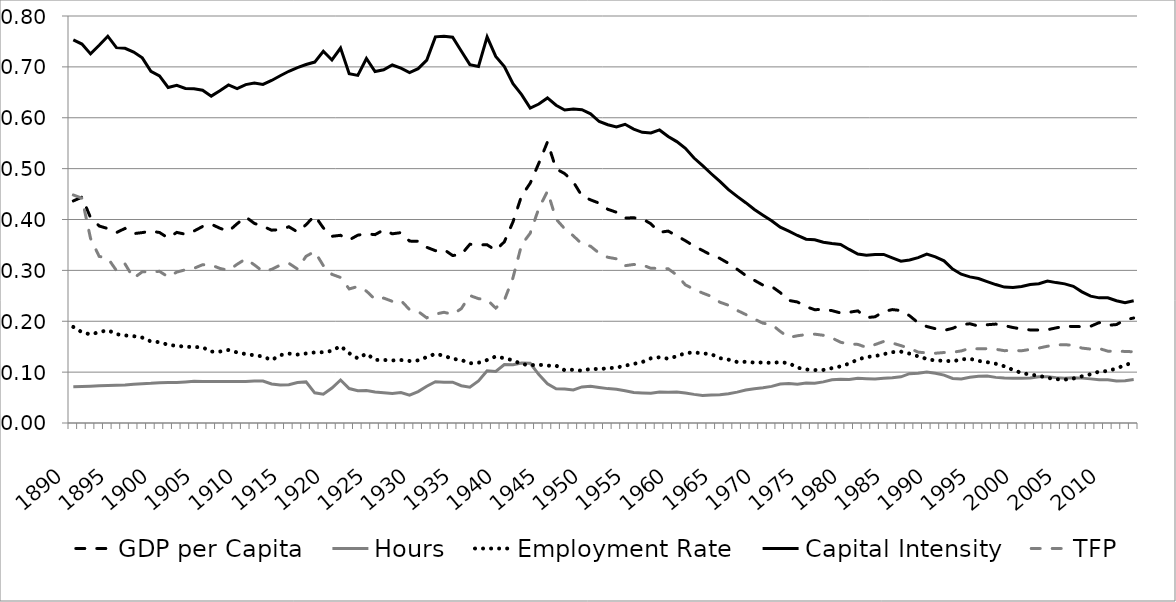
| Category | GDP per Capita | Hours | Employment Rate | Capital Intensity | TFP |
|---|---|---|---|---|---|
| 1890.0 | 0.437 | 0.071 | 0.189 | 0.753 | 0.448 |
| 1891.0 | 0.444 | 0.072 | 0.178 | 0.745 | 0.442 |
| 1892.0 | 0.404 | 0.072 | 0.174 | 0.726 | 0.363 |
| 1893.0 | 0.387 | 0.073 | 0.179 | 0.742 | 0.328 |
| 1894.0 | 0.382 | 0.074 | 0.183 | 0.76 | 0.324 |
| 1895.0 | 0.374 | 0.074 | 0.175 | 0.738 | 0.3 |
| 1896.0 | 0.382 | 0.075 | 0.172 | 0.737 | 0.313 |
| 1897.0 | 0.372 | 0.076 | 0.171 | 0.729 | 0.285 |
| 1898.0 | 0.374 | 0.077 | 0.168 | 0.718 | 0.297 |
| 1899.0 | 0.377 | 0.078 | 0.16 | 0.691 | 0.297 |
| 1900.0 | 0.374 | 0.079 | 0.159 | 0.682 | 0.298 |
| 1901.0 | 0.364 | 0.079 | 0.154 | 0.659 | 0.287 |
| 1902.0 | 0.375 | 0.08 | 0.152 | 0.664 | 0.297 |
| 1903.0 | 0.371 | 0.081 | 0.15 | 0.658 | 0.301 |
| 1904.0 | 0.377 | 0.082 | 0.149 | 0.657 | 0.304 |
| 1905.0 | 0.386 | 0.082 | 0.149 | 0.654 | 0.311 |
| 1906.0 | 0.391 | 0.081 | 0.14 | 0.643 | 0.311 |
| 1907.0 | 0.383 | 0.081 | 0.14 | 0.653 | 0.304 |
| 1908.0 | 0.377 | 0.081 | 0.144 | 0.664 | 0.3 |
| 1909.0 | 0.392 | 0.081 | 0.139 | 0.657 | 0.312 |
| 1910.0 | 0.405 | 0.082 | 0.135 | 0.665 | 0.323 |
| 1911.0 | 0.392 | 0.082 | 0.133 | 0.668 | 0.311 |
| 1912.0 | 0.387 | 0.083 | 0.131 | 0.665 | 0.298 |
| 1913.0 | 0.379 | 0.077 | 0.124 | 0.673 | 0.302 |
| 1914.0 | 0.38 | 0.075 | 0.133 | 0.683 | 0.31 |
| 1915.0 | 0.386 | 0.075 | 0.136 | 0.691 | 0.314 |
| 1916.0 | 0.376 | 0.08 | 0.135 | 0.699 | 0.303 |
| 1917.0 | 0.39 | 0.081 | 0.137 | 0.705 | 0.328 |
| 1918.0 | 0.408 | 0.059 | 0.139 | 0.709 | 0.337 |
| 1919.0 | 0.383 | 0.057 | 0.139 | 0.731 | 0.309 |
| 1920.0 | 0.367 | 0.069 | 0.142 | 0.714 | 0.292 |
| 1921.0 | 0.369 | 0.084 | 0.151 | 0.737 | 0.286 |
| 1922.0 | 0.36 | 0.068 | 0.137 | 0.687 | 0.263 |
| 1923.0 | 0.369 | 0.063 | 0.127 | 0.683 | 0.268 |
| 1924.0 | 0.372 | 0.064 | 0.136 | 0.716 | 0.259 |
| 1925.0 | 0.37 | 0.061 | 0.124 | 0.691 | 0.243 |
| 1926.0 | 0.38 | 0.059 | 0.124 | 0.694 | 0.246 |
| 1927.0 | 0.372 | 0.058 | 0.123 | 0.704 | 0.239 |
| 1928.0 | 0.374 | 0.06 | 0.124 | 0.697 | 0.241 |
| 1929.0 | 0.358 | 0.055 | 0.122 | 0.689 | 0.223 |
| 1930.0 | 0.357 | 0.062 | 0.123 | 0.697 | 0.219 |
| 1931.0 | 0.345 | 0.072 | 0.13 | 0.713 | 0.207 |
| 1932.0 | 0.339 | 0.081 | 0.136 | 0.759 | 0.214 |
| 1933.0 | 0.341 | 0.08 | 0.132 | 0.76 | 0.218 |
| 1934.0 | 0.329 | 0.08 | 0.126 | 0.758 | 0.214 |
| 1935.0 | 0.331 | 0.073 | 0.124 | 0.731 | 0.225 |
| 1936.0 | 0.351 | 0.07 | 0.117 | 0.704 | 0.25 |
| 1937.0 | 0.35 | 0.083 | 0.118 | 0.701 | 0.244 |
| 1938.0 | 0.35 | 0.103 | 0.124 | 0.759 | 0.242 |
| 1939.0 | 0.339 | 0.101 | 0.131 | 0.721 | 0.226 |
| 1940.0 | 0.356 | 0.115 | 0.127 | 0.701 | 0.241 |
| 1941.0 | 0.395 | 0.115 | 0.123 | 0.667 | 0.286 |
| 1942.0 | 0.447 | 0.118 | 0.116 | 0.645 | 0.351 |
| 1943.0 | 0.471 | 0.117 | 0.114 | 0.619 | 0.373 |
| 1944.0 | 0.511 | 0.095 | 0.115 | 0.627 | 0.422 |
| 1945.0 | 0.552 | 0.077 | 0.113 | 0.639 | 0.456 |
| 1946.0 | 0.5 | 0.067 | 0.113 | 0.625 | 0.401 |
| 1947.0 | 0.49 | 0.067 | 0.104 | 0.615 | 0.382 |
| 1948.0 | 0.474 | 0.065 | 0.105 | 0.617 | 0.368 |
| 1949.0 | 0.446 | 0.071 | 0.103 | 0.616 | 0.352 |
| 1950.0 | 0.439 | 0.072 | 0.106 | 0.608 | 0.347 |
| 1951.0 | 0.432 | 0.07 | 0.106 | 0.593 | 0.334 |
| 1952.0 | 0.42 | 0.068 | 0.108 | 0.586 | 0.326 |
| 1953.0 | 0.414 | 0.066 | 0.109 | 0.582 | 0.323 |
| 1954.0 | 0.403 | 0.063 | 0.113 | 0.587 | 0.309 |
| 1955.0 | 0.403 | 0.06 | 0.116 | 0.578 | 0.312 |
| 1956.0 | 0.402 | 0.059 | 0.12 | 0.571 | 0.311 |
| 1957.0 | 0.391 | 0.059 | 0.127 | 0.57 | 0.304 |
| 1958.0 | 0.375 | 0.061 | 0.129 | 0.576 | 0.304 |
| 1959.0 | 0.377 | 0.061 | 0.126 | 0.563 | 0.303 |
| 1960.0 | 0.368 | 0.061 | 0.131 | 0.553 | 0.291 |
| 1961.0 | 0.358 | 0.059 | 0.137 | 0.54 | 0.271 |
| 1962.0 | 0.348 | 0.056 | 0.139 | 0.521 | 0.263 |
| 1963.0 | 0.339 | 0.054 | 0.137 | 0.506 | 0.255 |
| 1964.0 | 0.33 | 0.055 | 0.135 | 0.49 | 0.249 |
| 1965.0 | 0.324 | 0.055 | 0.127 | 0.475 | 0.237 |
| 1966.0 | 0.314 | 0.058 | 0.125 | 0.459 | 0.231 |
| 1967.0 | 0.302 | 0.061 | 0.12 | 0.445 | 0.221 |
| 1968.0 | 0.29 | 0.065 | 0.12 | 0.433 | 0.213 |
| 1969.0 | 0.28 | 0.067 | 0.119 | 0.42 | 0.204 |
| 1970.0 | 0.271 | 0.069 | 0.119 | 0.408 | 0.196 |
| 1971.0 | 0.268 | 0.072 | 0.118 | 0.398 | 0.194 |
| 1972.0 | 0.256 | 0.077 | 0.12 | 0.385 | 0.18 |
| 1973.0 | 0.241 | 0.077 | 0.118 | 0.377 | 0.168 |
| 1974.0 | 0.238 | 0.076 | 0.109 | 0.369 | 0.172 |
| 1975.0 | 0.229 | 0.078 | 0.105 | 0.361 | 0.174 |
| 1976.0 | 0.223 | 0.078 | 0.104 | 0.36 | 0.175 |
| 1977.0 | 0.223 | 0.081 | 0.104 | 0.355 | 0.172 |
| 1978.0 | 0.221 | 0.085 | 0.108 | 0.353 | 0.167 |
| 1979.0 | 0.216 | 0.086 | 0.111 | 0.351 | 0.159 |
| 1980.0 | 0.218 | 0.086 | 0.117 | 0.341 | 0.155 |
| 1981.0 | 0.22 | 0.088 | 0.125 | 0.332 | 0.155 |
| 1982.0 | 0.207 | 0.087 | 0.13 | 0.33 | 0.149 |
| 1983.0 | 0.209 | 0.087 | 0.131 | 0.331 | 0.154 |
| 1984.0 | 0.219 | 0.088 | 0.135 | 0.331 | 0.16 |
| 1985.0 | 0.223 | 0.089 | 0.139 | 0.325 | 0.157 |
| 1986.0 | 0.221 | 0.091 | 0.14 | 0.318 | 0.152 |
| 1987.0 | 0.211 | 0.097 | 0.136 | 0.321 | 0.147 |
| 1988.0 | 0.197 | 0.098 | 0.131 | 0.325 | 0.139 |
| 1989.0 | 0.19 | 0.1 | 0.126 | 0.332 | 0.138 |
| 1990.0 | 0.185 | 0.098 | 0.123 | 0.327 | 0.137 |
| 1991.0 | 0.182 | 0.094 | 0.122 | 0.319 | 0.139 |
| 1992.0 | 0.186 | 0.088 | 0.121 | 0.303 | 0.139 |
| 1993.0 | 0.193 | 0.086 | 0.125 | 0.292 | 0.142 |
| 1994.0 | 0.195 | 0.09 | 0.126 | 0.287 | 0.147 |
| 1995.0 | 0.191 | 0.092 | 0.122 | 0.284 | 0.146 |
| 1996.0 | 0.193 | 0.092 | 0.12 | 0.278 | 0.146 |
| 1997.0 | 0.194 | 0.09 | 0.116 | 0.272 | 0.145 |
| 1998.0 | 0.192 | 0.088 | 0.111 | 0.267 | 0.142 |
| 1999.0 | 0.188 | 0.088 | 0.104 | 0.267 | 0.143 |
| 2000.0 | 0.185 | 0.088 | 0.098 | 0.268 | 0.142 |
| 2001.0 | 0.183 | 0.088 | 0.095 | 0.272 | 0.145 |
| 2002.0 | 0.183 | 0.091 | 0.093 | 0.274 | 0.147 |
| 2003.0 | 0.183 | 0.091 | 0.089 | 0.279 | 0.151 |
| 2004.0 | 0.187 | 0.089 | 0.086 | 0.276 | 0.154 |
| 2005.0 | 0.19 | 0.088 | 0.085 | 0.273 | 0.154 |
| 2006.0 | 0.19 | 0.089 | 0.087 | 0.269 | 0.153 |
| 2007.0 | 0.189 | 0.088 | 0.092 | 0.258 | 0.147 |
| 2008.0 | 0.19 | 0.087 | 0.096 | 0.249 | 0.145 |
| 2009.0 | 0.197 | 0.085 | 0.101 | 0.246 | 0.146 |
| 2010.0 | 0.192 | 0.085 | 0.102 | 0.246 | 0.141 |
| 2011.0 | 0.193 | 0.083 | 0.107 | 0.24 | 0.141 |
| 2012.0 | 0.203 | 0.083 | 0.114 | 0.236 | 0.141 |
| 2013.0 | 0.206 | 0.085 | 0.12 | 0.24 | 0.14 |